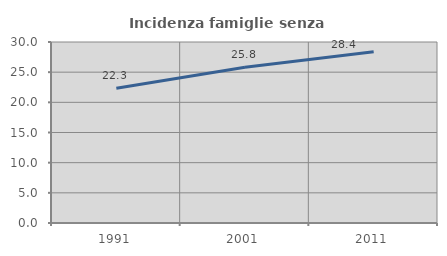
| Category | Incidenza famiglie senza nuclei |
|---|---|
| 1991.0 | 22.34 |
| 2001.0 | 25.823 |
| 2011.0 | 28.395 |